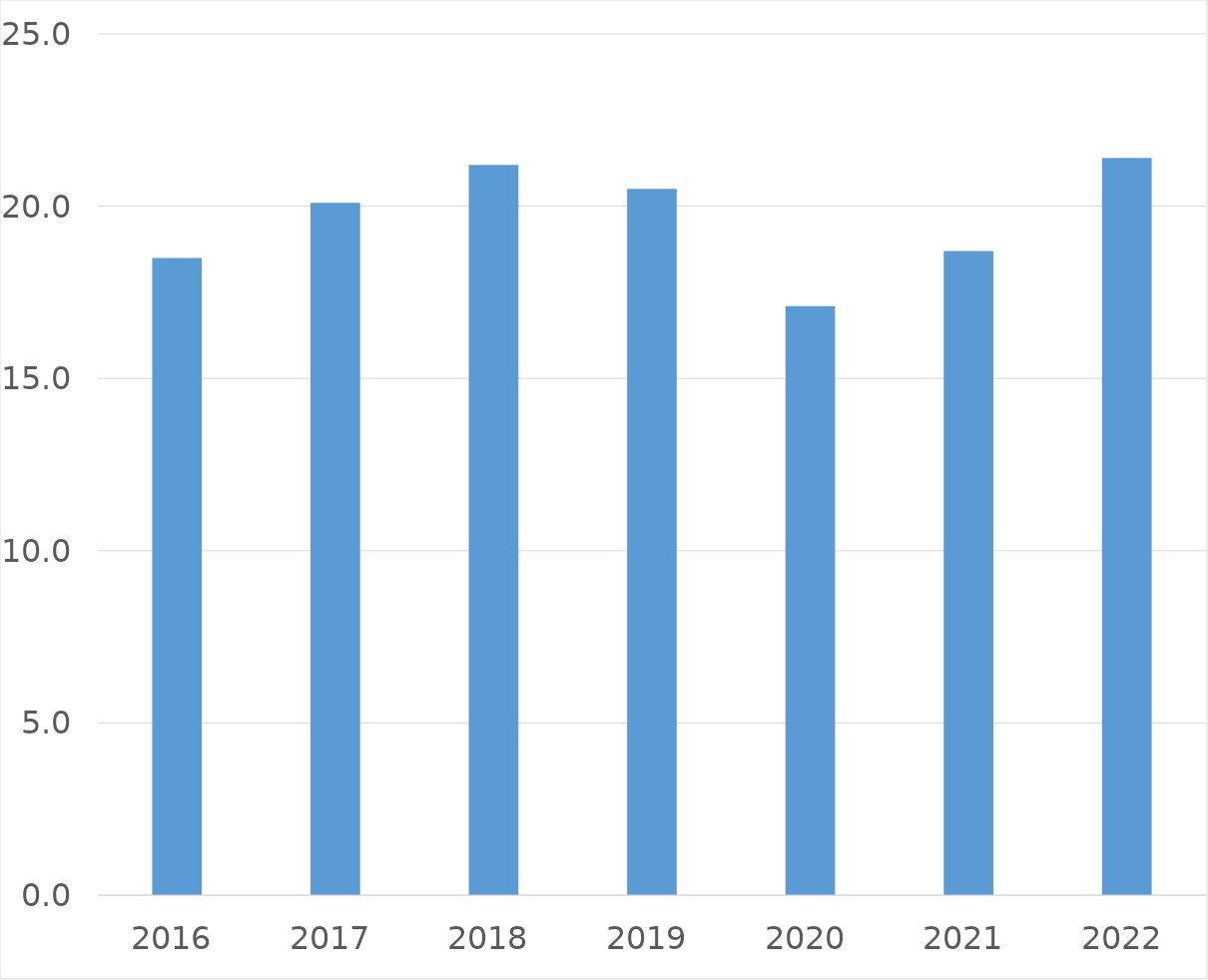
| Category | Series 0 |
|---|---|
| 2016 | 18.5 |
| 2017 | 20.1 |
| 2018 | 21.2 |
| 2019 | 20.5 |
| 2020 | 17.1 |
| 2021 | 18.7 |
| 2022 | 21.4 |